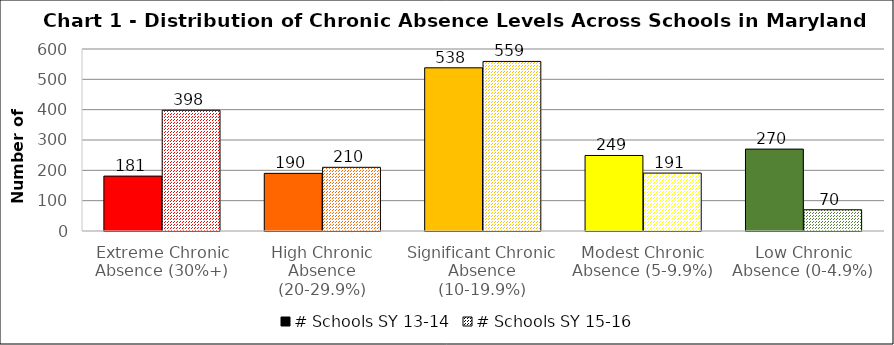
| Category | # Schools SY 13-14 | # Schools SY 15-16 |
|---|---|---|
| Extreme Chronic Absence (30%+) | 181 | 398 |
| High Chronic Absence (20-29.9%) | 190 | 210 |
| Significant Chronic Absence (10-19.9%) | 538 | 559 |
| Modest Chronic Absence (5-9.9%) | 249 | 191 |
| Low Chronic Absence (0-4.9%) | 270 | 70 |